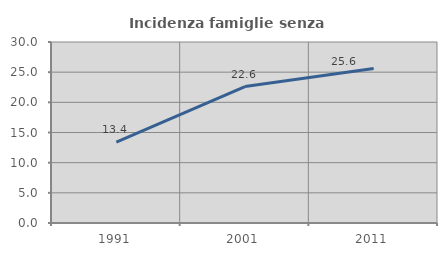
| Category | Incidenza famiglie senza nuclei |
|---|---|
| 1991.0 | 13.419 |
| 2001.0 | 22.615 |
| 2011.0 | 25.605 |